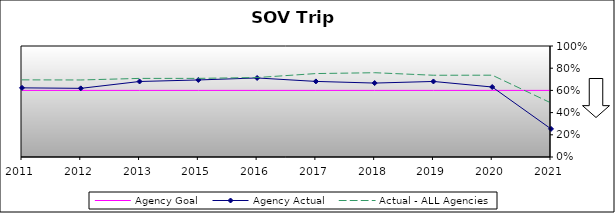
| Category | Agency Goal | Agency Actual | Actual - ALL Agencies |
|---|---|---|---|
| 2011.0 | 0.6 | 0.623 | 0.695 |
| 2012.0 | 0.6 | 0.618 | 0.694 |
| 2013.0 | 0.6 | 0.68 | 0.708 |
| 2015.0 | 0.6 | 0.694 | 0.708 |
| 2016.0 | 0.6 | 0.712 | 0.716 |
| 2017.0 | 0.6 | 0.681 | 0.752 |
| 2018.0 | 0.6 | 0.666 | 0.759 |
| 2019.0 | 0.6 | 0.681 | 0.736 |
| 2020.0 | 0.6 | 0.63 | 0.737 |
| 2021.0 | 0.6 | 0.253 | 0.487 |